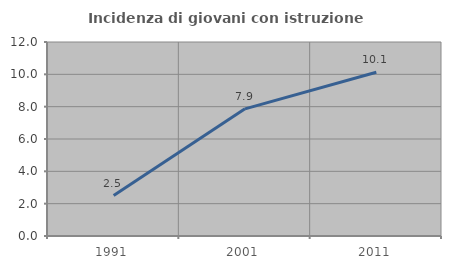
| Category | Incidenza di giovani con istruzione universitaria |
|---|---|
| 1991.0 | 2.5 |
| 2001.0 | 7.865 |
| 2011.0 | 10.127 |